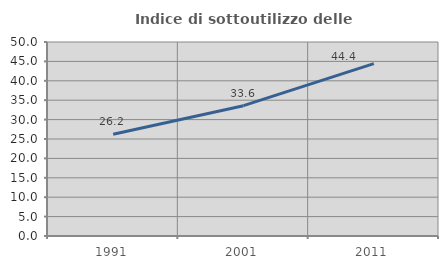
| Category | Indice di sottoutilizzo delle abitazioni  |
|---|---|
| 1991.0 | 26.242 |
| 2001.0 | 33.59 |
| 2011.0 | 44.423 |